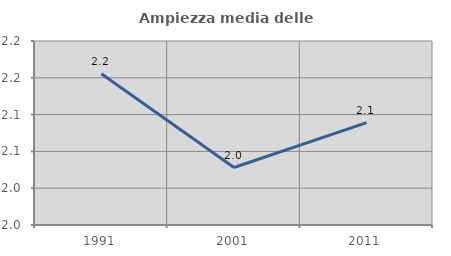
| Category | Ampiezza media delle famiglie |
|---|---|
| 1991.0 | 2.156 |
| 2001.0 | 2.028 |
| 2011.0 | 2.089 |